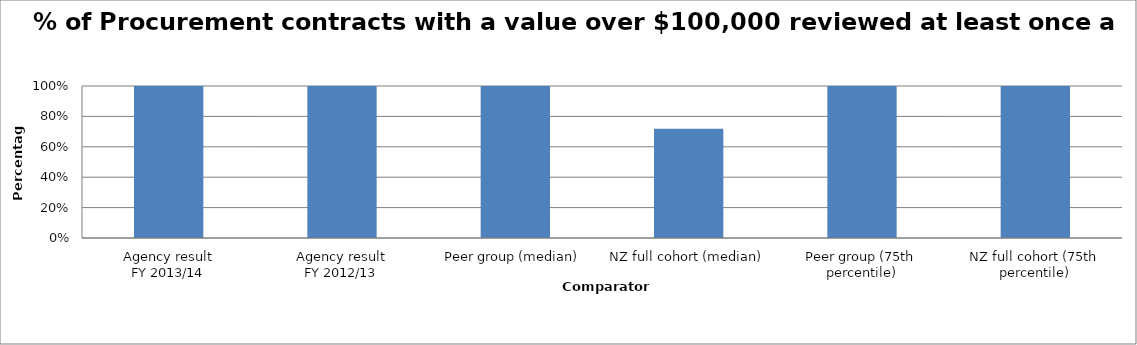
| Category | Series 0 |
|---|---|
| Agency result
FY 2013/14 | 1 |
| Agency result
FY 2012/13 | 1 |
| Peer group (median) | 1 |
| NZ full cohort (median) | 0.719 |
| Peer group (75th percentile) | 1 |
| NZ full cohort (75th percentile) | 1 |